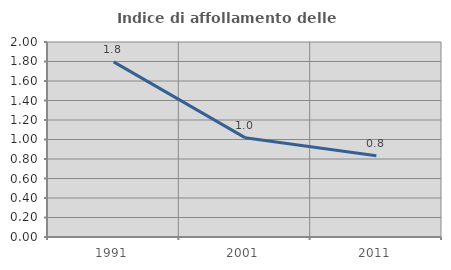
| Category | Indice di affollamento delle abitazioni  |
|---|---|
| 1991.0 | 1.796 |
| 2001.0 | 1.019 |
| 2011.0 | 0.834 |